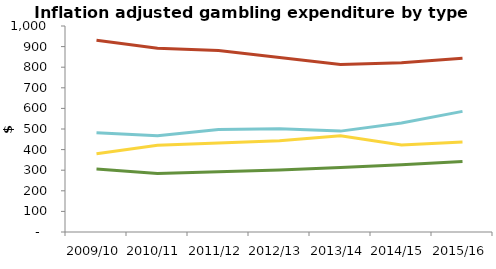
| Category | NZ Racing Board (TAB) | NZ Lotteries Commission | Gaming Machines (outside casinos) | Casinos |
|---|---|---|---|---|
| 2009/10 | 305.244 | 380.054 | 931.065 | 482.214 |
| 2010/11 | 284.11 | 421.257 | 891.616 | 466.936 |
| 2011/12 | 291.914 | 432.004 | 881.006 | 497.952 |
| 2012/13 | 301.542 | 442.473 | 847.167 | 501.646 |
| 2013/14 | 312.767 | 466.935 | 813.018 | 489.719 |
| 2014/15 | 326.405 | 422.129 | 821.522 | 529.3 |
| 2015/16 | 342.291 | 437.262 | 843.482 | 585.622 |